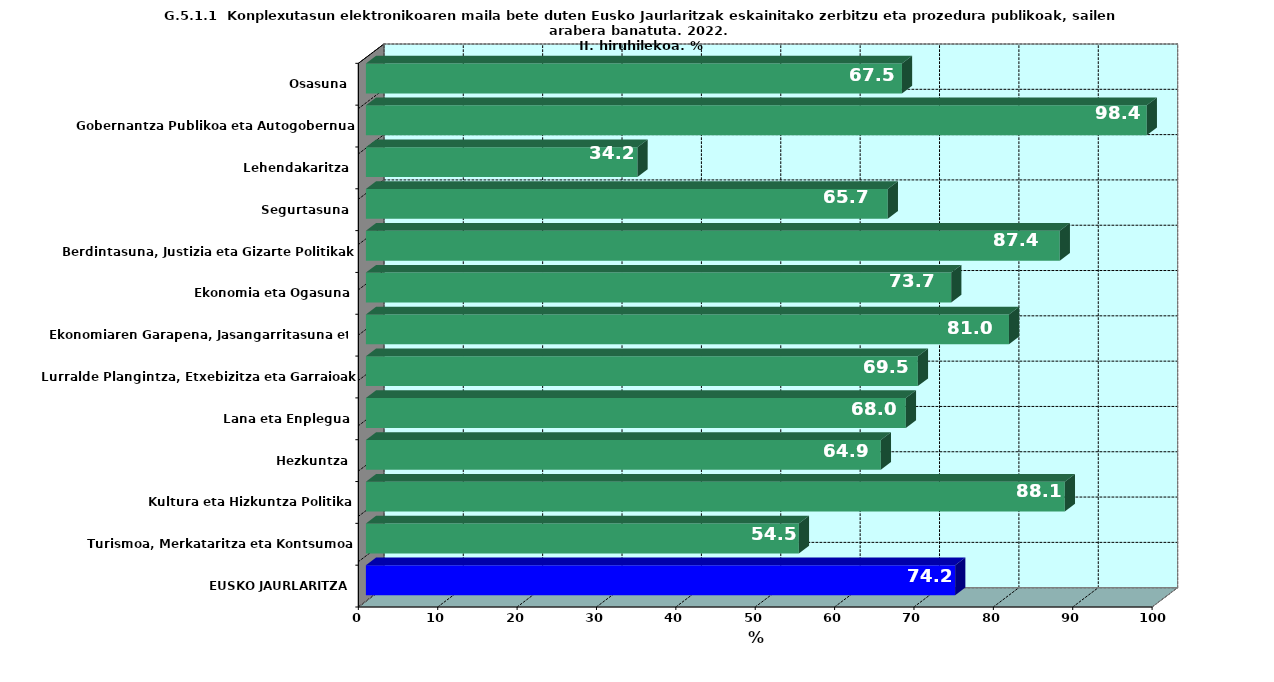
| Category | Series 0 |
|---|---|
| EUSKO JAURLARITZA | 74.235 |
| Turismoa, Merkataritza eta Kontsumoa | 54.545 |
| Kultura eta Hizkuntza Politika | 88.05 |
| Hezkuntza | 64.871 |
| Lana eta Enplegua | 68.023 |
| Lurralde Plangintza, Etxebizitza eta Garraioak | 69.536 |
| Ekonomiaren Garapena, Jasangarritasuna eta Ingurumena | 81.017 |
| Ekonomia eta Ogasuna | 73.737 |
| Berdintasuna, Justizia eta Gizarte Politikak | 87.413 |
| Segurtasuna | 65.746 |
| Lehendakaritza | 34.211 |
| Gobernantza Publikoa eta Autogobernua | 98.374 |
| Osasuna | 67.532 |